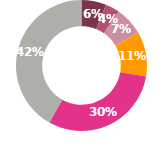
| Category | Series 0 |
|---|---|
| 0 | 0.062 |
| 1 | 0.036 |
| 2 | 0.071 |
| 3 | 0.113 |
| 4 | 0.31 |
| 5 | 0 |
| 6 | 0.426 |